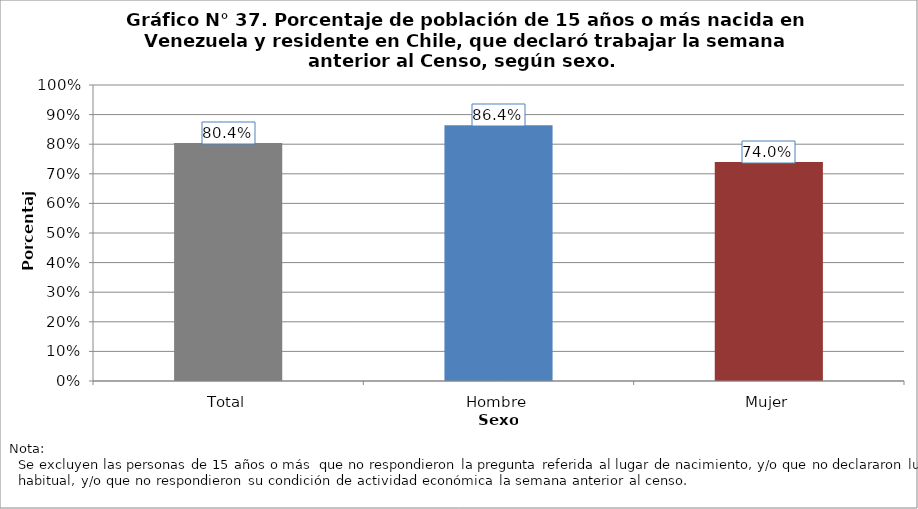
| Category | Población que declara trabajar  |
|---|---|
| Total | 0.804 |
| Hombre | 0.864 |
| Mujer | 0.74 |